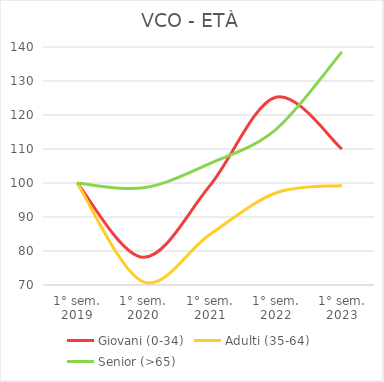
| Category | Giovani (0-34) | Adulti (35-64) | Senior (>65) |
|---|---|---|---|
| 1° sem.
2019 | 100 | 100 | 100 |
| 1° sem.
2020 | 78.151 | 70.931 | 98.571 |
| 1° sem.
2021 | 99.09 | 84.778 | 105.714 |
| 1° sem.
2022 | 125.21 | 97.066 | 115.714 |
| 1° sem.
2023 | 110.014 | 99.266 | 138.571 |